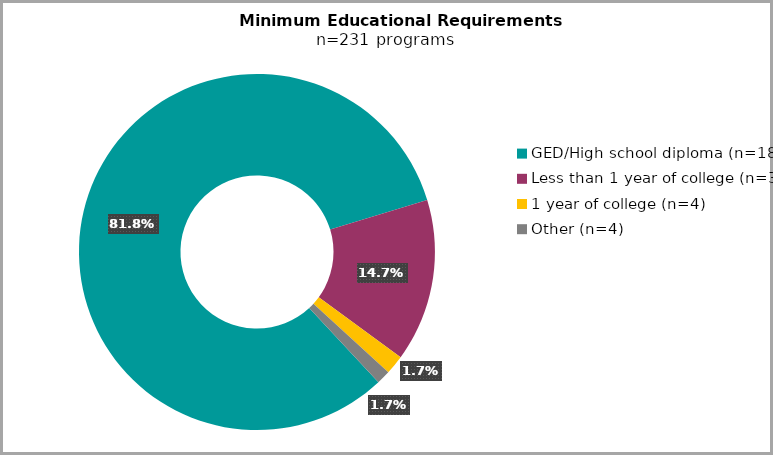
| Category | Series 0 |
|---|---|
| GED/High school diploma (n=189) | 0.818 |
| Less than 1 year of college (n=34) | 0.147 |
| 1 year of college (n=4) | 0.017 |
| Other (n=4) | 0.012 |